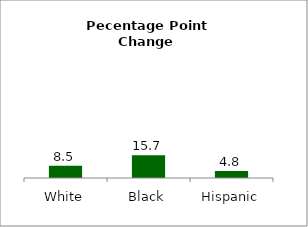
| Category | Series 0 |
|---|---|
| White | 8.459 |
| Black | 15.714 |
| Hispanic | 4.83 |